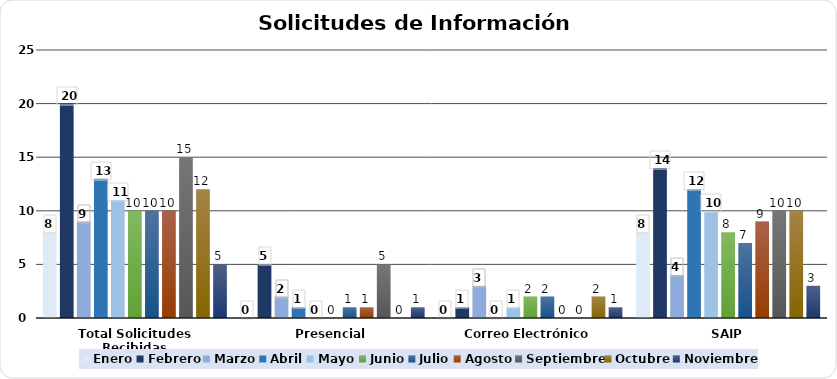
| Category | Enero | Febrero | Marzo | Abril | Mayo | Junio | Julio | Agosto | Septiembre | Octubre | Noviembre |
|---|---|---|---|---|---|---|---|---|---|---|---|
| Total Solicitudes Recibidas | 8 | 20 | 9 | 13 | 11 | 10 | 10 | 10 | 15 | 12 | 5 |
| Presencial | 0 | 5 | 2 | 1 | 0 | 0 | 1 | 1 | 5 | 0 | 1 |
| Correo Electrónico  | 0 | 1 | 3 | 0 | 1 | 2 | 2 | 0 | 0 | 2 | 1 |
| SAIP | 8 | 14 | 4 | 12 | 10 | 8 | 7 | 9 | 10 | 10 | 3 |